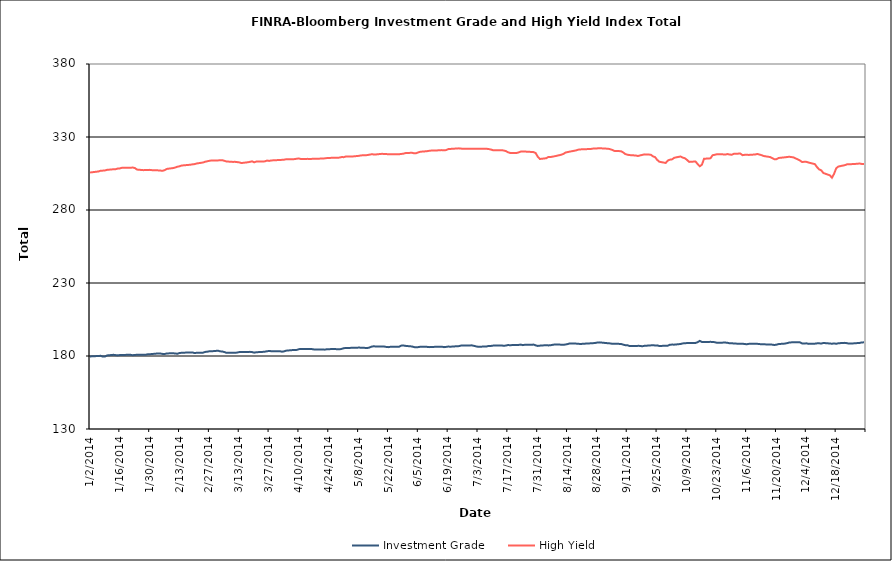
| Category | Investment Grade | High Yield |
|---|---|---|
| 1/2/14 | 179.728 | 305.662 |
| 1/3/14 | 179.753 | 305.864 |
| 1/6/14 | 180.039 | 306.408 |
| 1/7/14 | 180.116 | 306.94 |
| 1/8/14 | 179.579 | 306.969 |
| 1/9/14 | 179.671 | 307.098 |
| 1/10/14 | 180.4 | 307.505 |
| 1/13/14 | 180.811 | 307.909 |
| 1/14/14 | 180.596 | 307.963 |
| 1/15/14 | 180.41 | 308.397 |
| 1/16/14 | 180.672 | 308.499 |
| 1/17/14 | 180.742 | 308.963 |
| 1/21/14 | 180.804 | 308.937 |
| 1/22/14 | 180.542 | 309.084 |
| 1/23/14 | 180.718 | 308.76 |
| 1/24/14 | 180.846 | 307.697 |
| 1/27/14 | 180.803 | 307.291 |
| 1/28/14 | 180.86 | 307.421 |
| 1/29/14 | 181.147 | 307.34 |
| 1/30/14 | 181.221 | 307.5 |
| 1/31/14 | 181.355 | 307.291 |
| 2/3/14 | 181.763 | 307.131 |
| 2/4/14 | 181.689 | 307.001 |
| 2/5/14 | 181.423 | 306.844 |
| 2/6/14 | 181.395 | 307.294 |
| 2/7/14 | 181.768 | 308.141 |
| 2/10/14 | 181.871 | 308.736 |
| 2/11/14 | 181.686 | 309.108 |
| 2/12/14 | 181.564 | 309.671 |
| 2/13/14 | 182.068 | 309.957 |
| 2/14/14 | 182.2 | 310.47 |
| 2/18/14 | 182.466 | 310.993 |
| 2/19/14 | 182.465 | 311.258 |
| 2/20/14 | 182.013 | 311.434 |
| 2/21/14 | 182.187 | 311.855 |
| 2/24/14 | 182.309 | 312.532 |
| 2/25/14 | 182.786 | 313.061 |
| 2/26/14 | 182.966 | 313.386 |
| 2/27/14 | 183.242 | 313.688 |
| 2/28/14 | 183.242 | 313.95 |
| 3/3/14 | 183.617 | 313.958 |
| 3/4/14 | 183.201 | 314.086 |
| 3/5/14 | 183.098 | 314.146 |
| 3/6/14 | 182.707 | 313.68 |
| 3/7/14 | 182.162 | 313.23 |
| 3/10/14 | 182.161 | 312.94 |
| 3/11/14 | 182.18 | 312.996 |
| 3/12/14 | 182.373 | 312.805 |
| 3/13/14 | 182.68 | 312.601 |
| 3/14/14 | 182.791 | 312.17 |
| 3/17/14 | 182.764 | 312.694 |
| 3/18/14 | 182.841 | 312.994 |
| 3/19/14 | 182.684 | 313.321 |
| 3/20/14 | 182.283 | 312.665 |
| 3/21/14 | 182.579 | 313.2 |
| 3/24/14 | 182.821 | 313.213 |
| 3/25/14 | 182.966 | 313.327 |
| 3/26/14 | 183.239 | 313.866 |
| 3/27/14 | 183.453 | 313.624 |
| 3/28/14 | 183.28 | 313.939 |
| 3/31/14 | 183.295 | 314.186 |
| 4/1/14 | 183.326 | 314.175 |
| 4/2/14 | 182.944 | 314.368 |
| 4/3/14 | 183.181 | 314.462 |
| 4/4/14 | 183.667 | 314.772 |
| 4/7/14 | 184.06 | 314.72 |
| 4/8/14 | 184.138 | 314.878 |
| 4/9/14 | 184.201 | 315.146 |
| 4/10/14 | 184.696 | 315.282 |
| 4/11/14 | 184.791 | 314.863 |
| 4/14/14 | 184.777 | 315.029 |
| 4/15/14 | 184.821 | 314.902 |
| 4/16/14 | 184.74 | 315.02 |
| 4/17/14 | 184.509 | 315.085 |
| 4/21/14 | 184.449 | 315.235 |
| 4/22/14 | 184.345 | 315.366 |
| 4/23/14 | 184.609 | 315.544 |
| 4/24/14 | 184.557 | 315.604 |
| 4/25/14 | 184.79 | 315.711 |
| 4/28/14 | 184.686 | 315.777 |
| 4/29/14 | 184.555 | 315.908 |
| 4/30/14 | 184.879 | 316.245 |
| 5/1/14 | 185.332 | 316.202 |
| 5/2/14 | 185.496 | 316.636 |
| 5/5/14 | 185.588 | 316.655 |
| 5/6/14 | 185.606 | 316.793 |
| 5/7/14 | 185.64 | 316.933 |
| 5/8/14 | 185.782 | 317.079 |
| 5/9/14 | 185.695 | 317.384 |
| 5/12/14 | 185.477 | 317.601 |
| 5/13/14 | 185.77 | 317.893 |
| 5/14/14 | 186.391 | 318.157 |
| 5/15/14 | 186.658 | 318.079 |
| 5/16/14 | 186.536 | 318.037 |
| 5/19/14 | 186.535 | 318.482 |
| 5/20/14 | 186.465 | 318.324 |
| 5/21/14 | 186.201 | 318.324 |
| 5/22/14 | 186.056 | 318.13 |
| 5/23/14 | 186.327 | 318.26 |
| 5/27/14 | 186.419 | 318.216 |
| 5/28/14 | 187.106 | 318.396 |
| 5/29/14 | 187.185 | 318.6 |
| 5/30/14 | 186.936 | 318.99 |
| 6/2/14 | 186.525 | 319.196 |
| 6/3/14 | 186.096 | 318.824 |
| 6/4/14 | 185.923 | 318.923 |
| 6/5/14 | 186.096 | 319.519 |
| 6/6/14 | 186.357 | 319.906 |
| 6/9/14 | 186.269 | 320.267 |
| 6/10/14 | 186.071 | 320.527 |
| 6/11/14 | 186.117 | 320.701 |
| 6/12/14 | 186.209 | 320.732 |
| 6/13/14 | 186.298 | 320.741 |
| 6/16/14 | 186.394 | 321.02 |
| 6/17/14 | 186.061 | 320.916 |
| 6/18/14 | 186.227 | 321.023 |
| 6/19/14 | 186.477 | 321.712 |
| 6/20/14 | 186.358 | 321.828 |
| 6/23/14 | 186.687 | 322.129 |
| 6/24/14 | 186.768 | 322.229 |
| 6/25/14 | 187.112 | 322.061 |
| 6/26/14 | 187.237 | 321.92 |
| 6/27/14 | 187.246 | 321.907 |
| 6/30/14 | 187.28 | 321.988 |
| 7/1/14 | 186.985 | 321.994 |
| 7/2/14 | 186.597 | 321.974 |
| 7/3/14 | 186.327 | 321.934 |
| 7/7/14 | 186.526 | 321.932 |
| 7/8/14 | 186.93 | 321.735 |
| 7/9/14 | 186.875 | 321.432 |
| 7/10/14 | 187.101 | 320.961 |
| 7/11/14 | 187.261 | 320.984 |
| 7/14/14 | 187.168 | 320.983 |
| 7/15/14 | 187.05 | 320.744 |
| 7/16/14 | 187.124 | 320.402 |
| 7/17/14 | 187.478 | 319.546 |
| 7/18/14 | 187.415 | 319.119 |
| 7/21/14 | 187.552 | 319.067 |
| 7/22/14 | 187.59 | 319.413 |
| 7/23/14 | 187.802 | 320.013 |
| 7/24/14 | 187.45 | 320.044 |
| 7/25/14 | 187.698 | 320.029 |
| 7/28/14 | 187.674 | 319.769 |
| 7/29/14 | 187.837 | 319.656 |
| 7/30/14 | 187.301 | 319.047 |
| 7/31/14 | 186.886 | 316.528 |
| 8/1/14 | 187.092 | 314.942 |
| 8/4/14 | 187.413 | 315.476 |
| 8/5/14 | 187.252 | 316.358 |
| 8/6/14 | 187.363 | 316.277 |
| 8/7/14 | 187.673 | 316.579 |
| 8/8/14 | 187.896 | 316.826 |
| 8/11/14 | 187.77 | 317.856 |
| 8/12/14 | 187.676 | 318.383 |
| 8/13/14 | 187.876 | 319.344 |
| 8/14/14 | 188.161 | 319.663 |
| 8/15/14 | 188.62 | 319.986 |
| 8/18/14 | 188.479 | 320.831 |
| 8/19/14 | 188.396 | 321.336 |
| 8/20/14 | 188.206 | 321.492 |
| 8/21/14 | 188.347 | 321.61 |
| 8/22/14 | 188.447 | 321.622 |
| 8/25/14 | 188.701 | 321.818 |
| 8/26/14 | 188.792 | 322.093 |
| 8/27/14 | 188.959 | 322.039 |
| 8/28/14 | 189.247 | 322.212 |
| 8/29/14 | 189.332 | 322.307 |
| 9/2/14 | 188.727 | 321.963 |
| 9/3/14 | 188.618 | 321.632 |
| 9/4/14 | 188.349 | 321.109 |
| 9/5/14 | 188.346 | 320.463 |
| 9/8/14 | 188.284 | 320.285 |
| 9/9/14 | 187.806 | 319.5 |
| 9/10/14 | 187.427 | 318.374 |
| 9/11/14 | 187.429 | 317.872 |
| 9/12/14 | 186.837 | 317.625 |
| 9/15/14 | 186.884 | 317.32 |
| 9/16/14 | 186.942 | 316.989 |
| 9/17/14 | 186.928 | 317.395 |
| 9/18/14 | 186.65 | 317.716 |
| 9/19/14 | 186.954 | 318.104 |
| 9/22/14 | 187.276 | 317.886 |
| 9/23/14 | 187.426 | 316.785 |
| 9/24/14 | 187.209 | 316.242 |
| 9/25/14 | 187.279 | 314.369 |
| 9/26/14 | 186.843 | 313.067 |
| 9/29/14 | 187.044 | 312.227 |
| 9/30/14 | 187.078 | 313.839 |
| 10/1/14 | 187.741 | 314.5 |
| 10/2/14 | 187.805 | 314.68 |
| 10/3/14 | 187.775 | 315.764 |
| 10/6/14 | 188.229 | 316.652 |
| 10/7/14 | 188.613 | 315.906 |
| 10/8/14 | 188.736 | 315.449 |
| 10/9/14 | 188.86 | 314.322 |
| 10/10/14 | 188.827 | 312.945 |
| 10/13/14 | 188.921 | 313.229 |
| 10/14/14 | 189.474 | 311.473 |
| 10/15/14 | 190.361 | 309.937 |
| 10/16/14 | 189.617 | 311.032 |
| 10/17/14 | 189.527 | 315.087 |
| 10/20/14 | 189.692 | 315.391 |
| 10/21/14 | 189.622 | 317.481 |
| 10/22/14 | 189.473 | 317.828 |
| 10/23/14 | 189.056 | 318.169 |
| 10/24/14 | 189.113 | 318.268 |
| 10/27/14 | 189.192 | 317.999 |
| 10/28/14 | 189.053 | 318.308 |
| 10/29/14 | 188.673 | 318.003 |
| 10/30/14 | 188.788 | 317.85 |
| 10/31/14 | 188.531 | 318.489 |
| 11/3/14 | 188.389 | 318.666 |
| 11/4/14 | 188.42 | 317.568 |
| 11/5/14 | 188.206 | 317.764 |
| 11/6/14 | 188.056 | 317.831 |
| 11/7/14 | 188.309 | 317.73 |
| 11/10/14 | 188.303 | 318.028 |
| 11/11/14 | 188.337 | 318.366 |
| 11/12/14 | 188.151 | 317.973 |
| 11/13/14 | 188.062 | 317.544 |
| 11/14/14 | 188.002 | 316.97 |
| 11/17/14 | 187.855 | 316.264 |
| 11/18/14 | 187.783 | 315.504 |
| 11/19/14 | 187.533 | 314.749 |
| 11/20/14 | 187.762 | 314.823 |
| 11/21/14 | 188.187 | 315.646 |
| 11/24/14 | 188.506 | 316.096 |
| 11/25/14 | 188.832 | 316.289 |
| 11/26/14 | 189.221 | 316.481 |
| 11/28/14 | 189.453 | 316.019 |
| 12/1/14 | 189.339 | 313.923 |
| 12/2/14 | 188.594 | 312.837 |
| 12/3/14 | 188.505 | 313.025 |
| 12/4/14 | 188.701 | 312.974 |
| 12/5/14 | 188.301 | 312.533 |
| 12/8/14 | 188.448 | 311.404 |
| 12/9/14 | 188.664 | 309.375 |
| 12/10/14 | 188.681 | 307.796 |
| 12/11/14 | 188.559 | 307.125 |
| 12/12/14 | 188.929 | 305.319 |
| 12/15/14 | 188.561 | 303.76 |
| 12/16/14 | 188.411 | 302.104 |
| 12/17/14 | 188.632 | 304.814 |
| 12/18/14 | 188.376 | 308.594 |
| 12/19/14 | 188.733 | 309.774 |
| 12/22/14 | 188.996 | 310.688 |
| 12/23/14 | 188.785 | 311.246 |
| 12/24/14 | 188.507 | 311.397 |
| 12/26/14 | 188.632 | 311.433 |
| 12/29/14 | 188.966 | 311.834 |
| 12/30/14 | 189.326 | 311.52 |
| 12/31/14 | 189.333 | 311.585 |